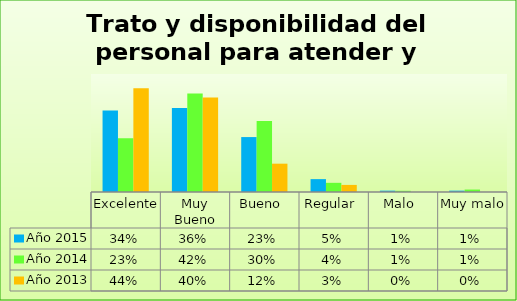
| Category | Año 2015 | Año 2014 | Año 2013 |
|---|---|---|---|
| Excelente | 0.345 | 0.228 | 0.44 |
| Muy Bueno | 0.356 | 0.417 | 0.4 |
| Bueno  | 0.233 | 0.301 | 0.12 |
| Regular  | 0.055 | 0.039 | 0.03 |
| Malo  | 0.006 | 0.005 | 0 |
| Muy malo  | 0.006 | 0.01 | 0 |